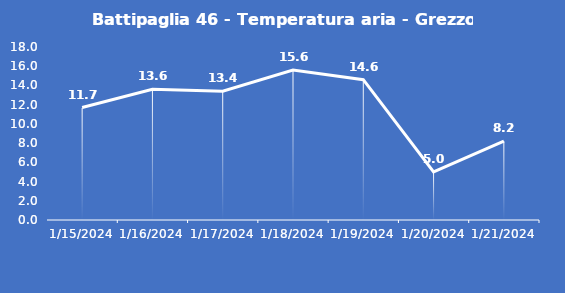
| Category | Battipaglia 46 - Temperatura aria - Grezzo (°C) |
|---|---|
| 1/15/24 | 11.7 |
| 1/16/24 | 13.6 |
| 1/17/24 | 13.4 |
| 1/18/24 | 15.6 |
| 1/19/24 | 14.6 |
| 1/20/24 | 5 |
| 1/21/24 | 8.2 |